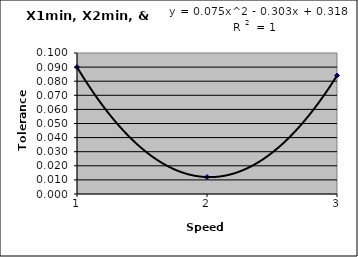
| Category | Series 0 |
|---|---|
| 0 | 0.09 |
| 1 | 0.012 |
| 2 | 0.084 |